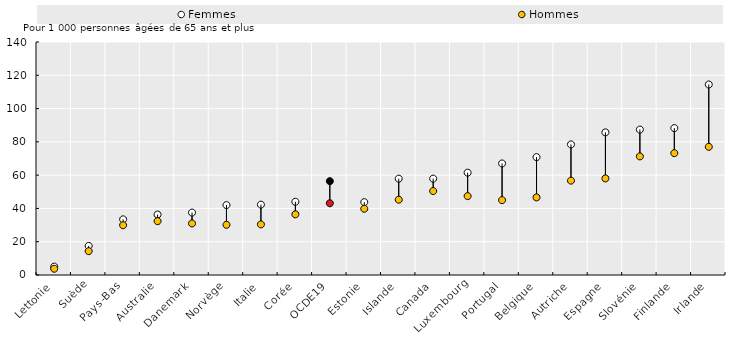
| Category | Femmes | Hommes |
|---|---|---|
| Lettonie | 5.059 | 3.759 |
| Suède | 17.46 | 14.324 |
| Pays-Bas | 33.426 | 29.91 |
| Australie | 36.311 | 32.354 |
| Danemark | 37.518 | 30.979 |
| Norvège | 42.008 | 30.154 |
| Italie | 42.288 | 30.406 |
| Corée | 43.998 | 36.451 |
| OCDE19 | 56.378 | 43.11 |
| Estonie | 43.762 | 39.809 |
| Islande | 57.874 | 45.25 |
| Canada | 57.899 | 50.444 |
| Luxembourg | 61.474 | 47.397 |
| Portugal | 67.01 | 44.98 |
| Belgique | 70.82 | 46.643 |
| Autriche | 78.47 | 56.7 |
| Espagne | 85.706 | 58.034 |
| Slovénie | 87.384 | 71.27 |
| Finlande | 88.26 | 73.201 |
| Irlande | 114.46 | 77.019 |